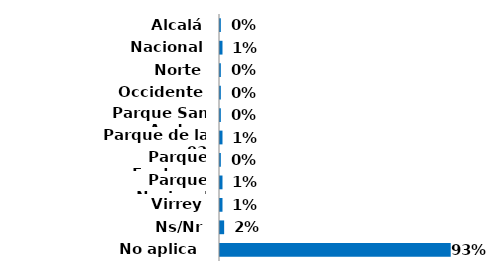
| Category | Series 0 |
|---|---|
| Alcalá | 0.003 |
| Nacional | 0.01 |
| Norte | 0.003 |
| Occidente | 0.003 |
| Parque San Andres | 0.003 |
| Parque de la 93 | 0.01 |
| Parque Fontanar | 0.003 |
| Parque Nacional | 0.01 |
| Virrey | 0.01 |
| Ns/Nr | 0.017 |
| No aplica  | 0.927 |